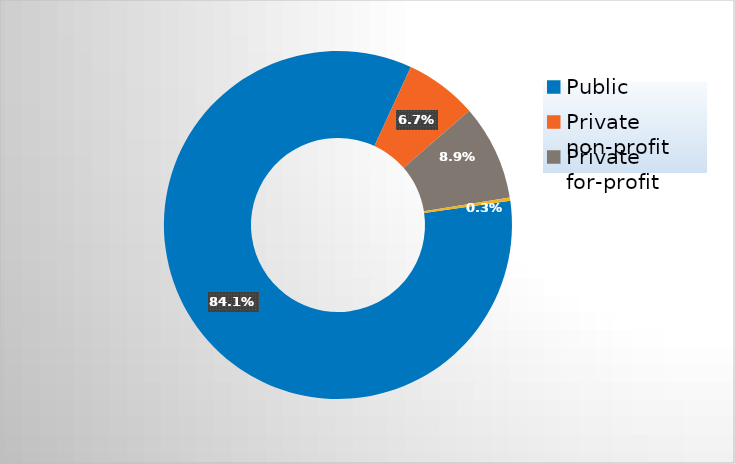
| Category | Series 0 |
|---|---|
| Public | 0.841 |
| Private non-profit | 0.067 |
| Private for-profit | 0.089 |
| Private, state-related | 0.003 |